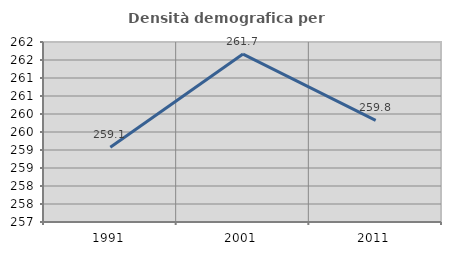
| Category | Densità demografica |
|---|---|
| 1991.0 | 259.076 |
| 2001.0 | 261.664 |
| 2011.0 | 259.821 |